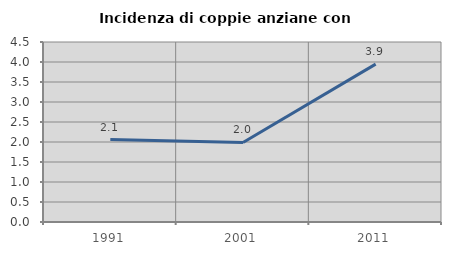
| Category | Incidenza di coppie anziane con figli |
|---|---|
| 1991.0 | 2.06 |
| 2001.0 | 1.988 |
| 2011.0 | 3.947 |